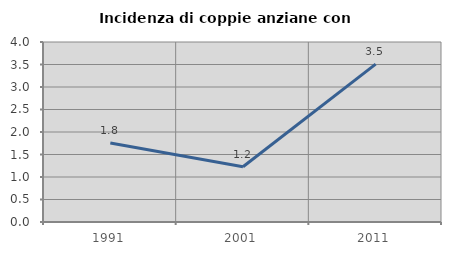
| Category | Incidenza di coppie anziane con figli |
|---|---|
| 1991.0 | 1.754 |
| 2001.0 | 1.227 |
| 2011.0 | 3.509 |